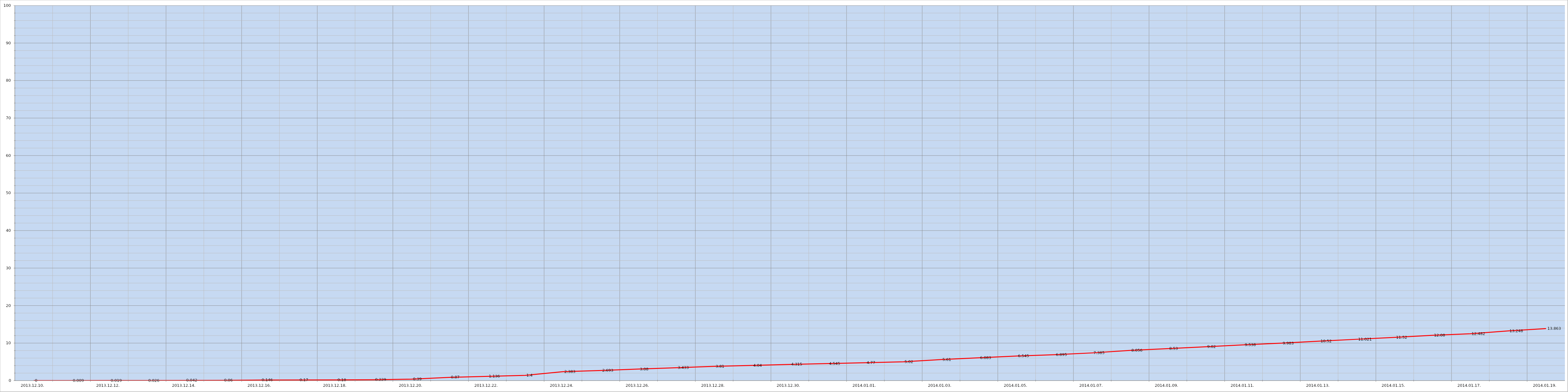
| Category | Szerver 11 |
|---|---|
| 2013-12-10 | 0 |
| 2013-12-11 | 0.009 |
| 2013-12-12 | 0.019 |
| 2013-12-13 | 0.026 |
| 2013-12-14 | 0.042 |
| 2013-12-15 | 0.06 |
| 2013-12-16 | 0.146 |
| 2013-12-17 | 0.17 |
| 2013-12-18 | 0.18 |
| 2013-12-19 | 0.229 |
| 2013-12-20 | 0.39 |
| 2013-12-21 | 0.87 |
| 2013-12-22 | 1.136 |
| 2013-12-23 | 1.4 |
| 2013-12-24 | 2.383 |
| 2013-12-25 | 2.693 |
| 2013-12-26 | 3.08 |
| 2013-12-27 | 3.433 |
| 2013-12-28 | 3.81 |
| 2013-12-29 | 4.04 |
| 2013-12-30 | 4.315 |
| 2013-12-31 | 4.545 |
| 2014-01-01 | 4.77 |
| 2014-01-02 | 5.02 |
| 2014-01-03 | 5.61 |
| 2014-01-04 | 6.083 |
| 2014-01-05 | 6.545 |
| 2014-01-06 | 6.895 |
| 2014-01-07 | 7.385 |
| 2014-01-08 | 8.056 |
| 2014-01-09 | 8.53 |
| 2014-01-10 | 9.02 |
| 2014-01-11 | 9.538 |
| 2014-01-12 | 9.983 |
| 2014-01-13 | 10.52 |
| 2014-01-14 | 11.021 |
| 2014-01-15 | 11.52 |
| 2014-01-16 | 12.08 |
| 2014-01-17 | 12.482 |
| 2014-01-18 | 13.248 |
| 2014-01-19 | 13.863 |